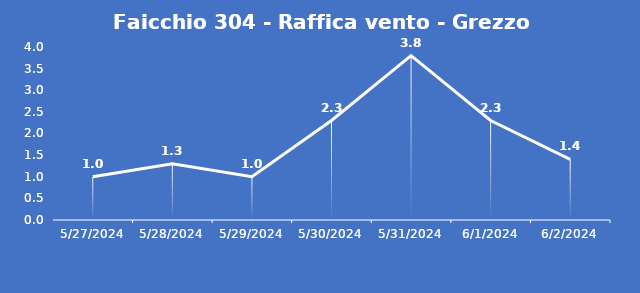
| Category | Faicchio 304 - Raffica vento - Grezzo (m/s) |
|---|---|
| 5/27/24 | 1 |
| 5/28/24 | 1.3 |
| 5/29/24 | 1 |
| 5/30/24 | 2.3 |
| 5/31/24 | 3.8 |
| 6/1/24 | 2.3 |
| 6/2/24 | 1.4 |